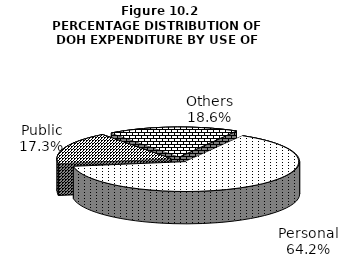
| Category | Series 0 |
|---|---|
| Personal | 8833.82 |
| Public | 2375.754 |
| Others | 2554.893 |